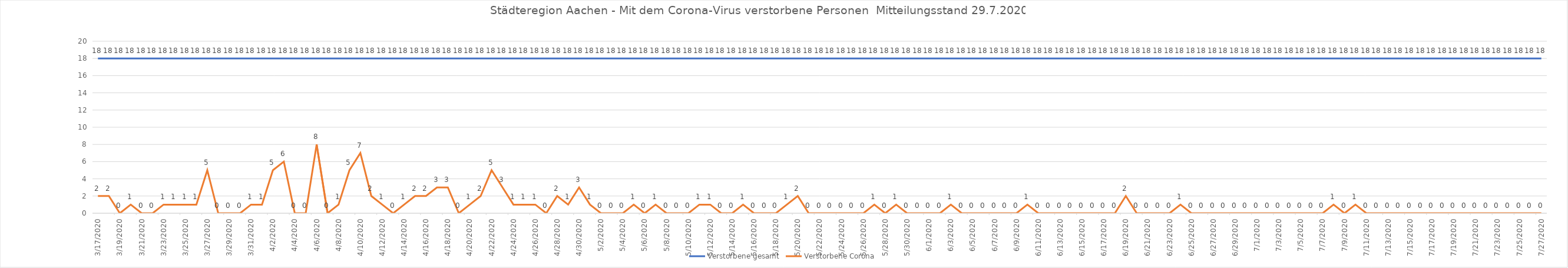
| Category | Verstorbene gesamt | Verstorbene Corona |
|---|---|---|
| 3/17/20 | 18 | 2 |
| 3/18/20 | 18 | 2 |
| 3/19/20 | 18 | 0 |
| 3/20/20 | 18 | 1 |
| 3/21/20 | 18 | 0 |
| 3/22/20 | 18 | 0 |
| 3/23/20 | 18 | 1 |
| 3/24/20 | 18 | 1 |
| 3/25/20 | 18 | 1 |
| 3/26/20 | 18 | 1 |
| 3/27/20 | 18 | 5 |
| 3/28/20 | 18 | 0 |
| 3/29/20 | 18 | 0 |
| 3/30/20 | 18 | 0 |
| 3/31/20 | 18 | 1 |
| 4/1/20 | 18 | 1 |
| 4/2/20 | 18 | 5 |
| 4/3/20 | 18 | 6 |
| 4/4/20 | 18 | 0 |
| 4/5/20 | 18 | 0 |
| 4/6/20 | 18 | 8 |
| 4/7/20 | 18 | 0 |
| 4/8/20 | 18 | 1 |
| 4/9/20 | 18 | 5 |
| 4/10/20 | 18 | 7 |
| 4/11/20 | 18 | 2 |
| 4/12/20 | 18 | 1 |
| 4/13/20 | 18 | 0 |
| 4/14/20 | 18 | 1 |
| 4/15/20 | 18 | 2 |
| 4/16/20 | 18 | 2 |
| 4/17/20 | 18 | 3 |
| 4/18/20 | 18 | 3 |
| 4/19/20 | 18 | 0 |
| 4/20/20 | 18 | 1 |
| 4/21/20 | 18 | 2 |
| 4/22/20 | 18 | 5 |
| 4/23/20 | 18 | 3 |
| 4/24/20 | 18 | 1 |
| 4/25/20 | 18 | 1 |
| 4/26/20 | 18 | 1 |
| 4/27/20 | 18 | 0 |
| 4/28/20 | 18 | 2 |
| 4/29/20 | 18 | 1 |
| 4/30/20 | 18 | 3 |
| 5/1/20 | 18 | 1 |
| 5/2/20 | 18 | 0 |
| 5/3/20 | 18 | 0 |
| 5/4/20 | 18 | 0 |
| 5/5/20 | 18 | 1 |
| 5/6/20 | 18 | 0 |
| 5/7/20 | 18 | 1 |
| 5/8/20 | 18 | 0 |
| 5/9/20 | 18 | 0 |
| 5/10/20 | 18 | 0 |
| 5/11/20 | 18 | 1 |
| 5/12/20 | 18 | 1 |
| 5/13/20 | 18 | 0 |
| 5/14/20 | 18 | 0 |
| 5/15/20 | 18 | 1 |
| 5/16/20 | 18 | 0 |
| 5/17/20 | 18 | 0 |
| 5/18/20 | 18 | 0 |
| 5/19/20 | 18 | 1 |
| 5/20/20 | 18 | 2 |
| 5/21/20 | 18 | 0 |
| 5/22/20 | 18 | 0 |
| 5/23/20 | 18 | 0 |
| 5/24/20 | 18 | 0 |
| 5/25/20 | 18 | 0 |
| 5/26/20 | 18 | 0 |
| 5/27/20 | 18 | 1 |
| 5/28/20 | 18 | 0 |
| 5/29/20 | 18 | 1 |
| 5/30/20 | 18 | 0 |
| 5/31/20 | 18 | 0 |
| 6/1/20 | 18 | 0 |
| 6/2/20 | 18 | 0 |
| 6/3/20 | 18 | 1 |
| 6/4/20 | 18 | 0 |
| 6/5/20 | 18 | 0 |
| 6/6/20 | 18 | 0 |
| 6/7/20 | 18 | 0 |
| 6/8/20 | 18 | 0 |
| 6/9/20 | 18 | 0 |
| 6/10/20 | 18 | 1 |
| 6/11/20 | 18 | 0 |
| 6/12/20 | 18 | 0 |
| 6/13/20 | 18 | 0 |
| 6/14/20 | 18 | 0 |
| 6/15/20 | 18 | 0 |
| 6/16/20 | 18 | 0 |
| 6/17/20 | 18 | 0 |
| 6/18/20 | 18 | 0 |
| 6/19/20 | 18 | 2 |
| 6/20/20 | 18 | 0 |
| 6/21/20 | 18 | 0 |
| 6/22/20 | 18 | 0 |
| 6/23/20 | 18 | 0 |
| 6/24/20 | 18 | 1 |
| 6/25/20 | 18 | 0 |
| 6/26/20 | 18 | 0 |
| 6/27/20 | 18 | 0 |
| 6/28/20 | 18 | 0 |
| 6/29/20 | 18 | 0 |
| 6/30/20 | 18 | 0 |
| 7/1/20 | 18 | 0 |
| 7/2/20 | 18 | 0 |
| 7/3/20 | 18 | 0 |
| 7/4/20 | 18 | 0 |
| 7/5/20 | 18 | 0 |
| 7/6/20 | 18 | 0 |
| 7/7/20 | 18 | 0 |
| 7/8/20 | 18 | 1 |
| 7/9/20 | 18 | 0 |
| 7/10/20 | 18 | 1 |
| 7/11/20 | 18 | 0 |
| 7/12/20 | 18 | 0 |
| 7/13/20 | 18 | 0 |
| 7/14/20 | 18 | 0 |
| 7/15/20 | 18 | 0 |
| 7/16/20 | 18 | 0 |
| 7/17/20 | 18 | 0 |
| 7/18/20 | 18 | 0 |
| 7/19/20 | 18 | 0 |
| 7/20/20 | 18 | 0 |
| 7/21/20 | 18 | 0 |
| 7/22/20 | 18 | 0 |
| 7/23/20 | 18 | 0 |
| 7/24/20 | 18 | 0 |
| 7/25/20 | 18 | 0 |
| 7/26/20 | 18 | 0 |
| 7/27/20 | 18 | 0 |